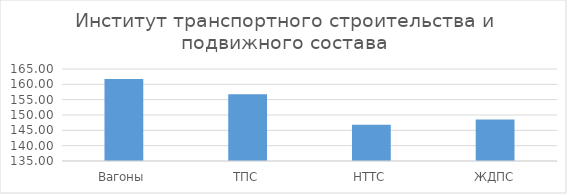
| Category | Series 0 |
|---|---|
| Вагоны | 161.75 |
| ТПС | 156.75 |
| НТТС | 146.8 |
| ЖДПС | 148.5 |